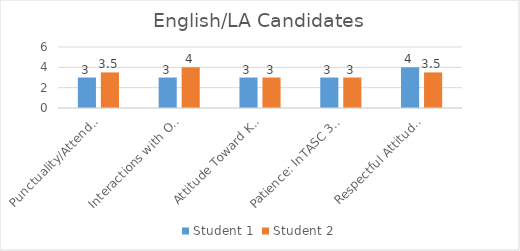
| Category | Student 1 | Student 2 |
|---|---|---|
| Punctuality/Attendance: InTASC 1, 9 | 3 | 3.5 |
| Interactions with Others: InTASC 3, 7, 10 | 3 | 4 |
| Attitude Toward Knowledge and Learning: InTASC 1, 4, 5, 9, 10 | 3 | 3 |
| Patience: InTASC 3, 10 | 3 | 3 |
| Respectful Attitude: InTASC 3, 7, 10 | 4 | 3.5 |